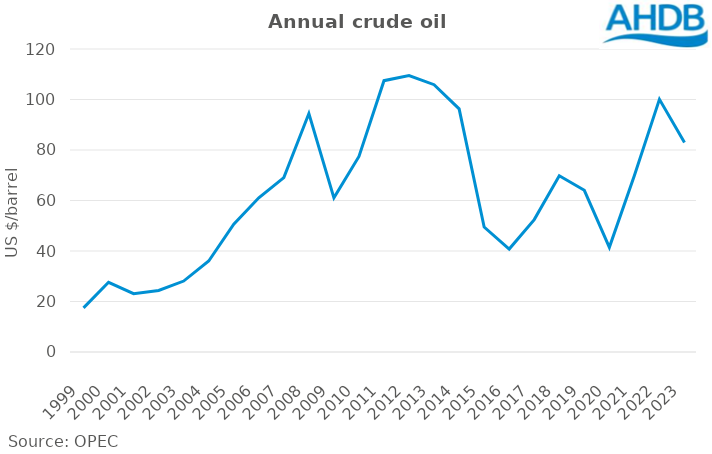
| Category | (US$/barrel) |
|---|---|
| 1999.0 | 17.48 |
| 2000.0 | 27.6 |
| 2001.0 | 23.12 |
| 2002.0 | 24.36 |
| 2003.0 | 28.1 |
| 2004.0 | 36.05 |
| 2005.0 | 50.64 |
| 2006.0 | 61.08 |
| 2007.0 | 69.08 |
| 2008.0 | 94.45 |
| 2009.0 | 61.06 |
| 2010.0 | 77.45 |
| 2011.0 | 107.46 |
| 2012.0 | 109.45 |
| 2013.0 | 105.87 |
| 2014.0 | 96.29 |
| 2015.0 | 49.49 |
| 2016.0 | 40.76 |
| 2017.0 | 52.43 |
| 2018.0 | 69.78 |
| 2019.0 | 64.04 |
| 2020.0 | 41.47 |
| 2021.0 | 69.89 |
| 2022.0 | 100.08 |
| 2023.0 | 82.95 |